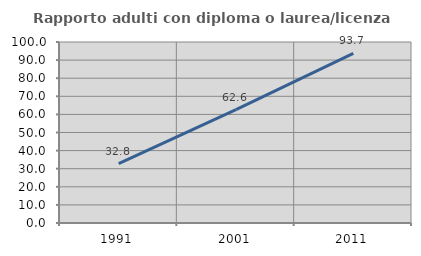
| Category | Rapporto adulti con diploma o laurea/licenza media  |
|---|---|
| 1991.0 | 32.787 |
| 2001.0 | 62.59 |
| 2011.0 | 93.678 |